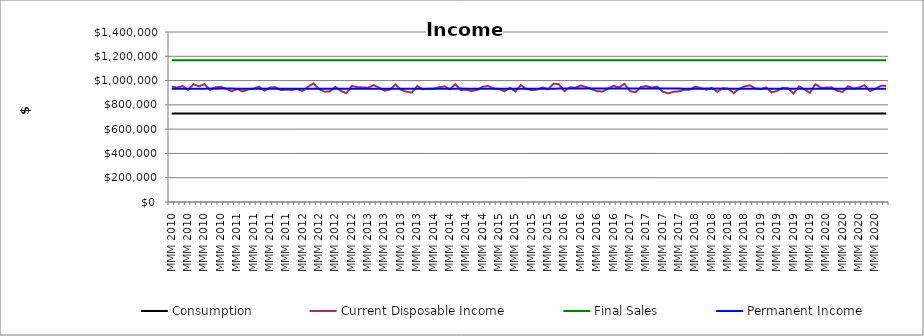
| Category | Consumption | Current Disposable Income | Final Sales | Permanent Income |
|---|---|---|---|---|
| MMM 2010 | 728000 | 950547.733 | 1167555.348 | 933333.333 |
| MMM 2010 | 728037.298 | 942081.337 | 1167587.925 | 933381.151 |
| MMM 2010 | 728056.148 | 955618.483 | 1167547.304 | 933405.318 |
| MMM 2010 | 728104.277 | 924047.333 | 1167688.777 | 933467.022 |
| MMM 2010 | 728083.867 | 969966.99 | 1167775.61 | 933440.856 |
| MMM 2010 | 728163.007 | 952516.851 | 1167748.387 | 933542.317 |
| MMM 2010 | 728204.119 | 970972.306 | 1167801.812 | 933595.024 |
| MMM 2010 | 728285.103 | 922945.713 | 1167863.32 | 933698.85 |
| MMM 2010 | 728261.805 | 944364.396 | 1167856.354 | 933668.98 |
| MMM 2010 | 728284.978 | 948574.709 | 1167923.499 | 933698.69 |
| MMM 2010 | 728317.209 | 932840.603 | 1167964.068 | 933740.012 |
| MMM 2010 | 728315.261 | 910995.255 | 1167988.229 | 933737.514 |
| MMM 2011 | 728265.986 | 930966.396 | 1167969.109 | 933674.341 |
| MMM 2011 | 728260.119 | 910307.312 | 1167927.119 | 933666.819 |
| MMM 2011 | 728209.506 | 927209.217 | 1167968.233 | 933601.931 |
| MMM 2011 | 728195.655 | 933638.354 | 1167876.107 | 933584.174 |
| MMM 2011 | 728195.773 | 950150.486 | 1167935.233 | 933584.324 |
| MMM 2011 | 728231.666 | 916823.252 | 1168064.914 | 933630.341 |
| MMM 2011 | 728195.251 | 942106.105 | 1168135.653 | 933583.655 |
| MMM 2011 | 728213.716 | 945400.962 | 1168028.992 | 933607.328 |
| MMM 2011 | 728239.269 | 920950.151 | 1168060.743 | 933640.088 |
| MMM 2011 | 728211.774 | 925268.782 | 1168107.6 | 933604.839 |
| MMM 2011 | 728193.713 | 922756.403 | 1167979.889 | 933581.683 |
| MMM 2011 | 728170.258 | 929890.56 | 1167988.446 | 933551.613 |
| MMM 2012 | 728162.326 | 914467.68 | 1167974.104 | 933541.443 |
| MMM 2012 | 728120.999 | 949306.701 | 1167985.787 | 933488.46 |
| MMM 2012 | 728155.272 | 976942.138 | 1168085.614 | 933532.4 |
| MMM 2012 | 728249.326 | 930227.293 | 1168207.326 | 933652.983 |
| MMM 2012 | 728241.904 | 908141.355 | 1168272.72 | 933643.467 |
| MMM 2012 | 728186.649 | 910837.618 | 1168288.374 | 933572.628 |
| MMM 2012 | 728137.39 | 949292.949 | 1168217.266 | 933509.475 |
| MMM 2012 | 728171.588 | 914965.109 | 1168207.924 | 933553.318 |
| MMM 2012 | 728131.313 | 895037.434 | 1168121.393 | 933501.684 |
| MMM 2012 | 728047.974 | 955815.453 | 1168095.476 | 933394.839 |
| MMM 2012 | 728096.552 | 946034.859 | 1168068.922 | 933457.118 |
| MMM 2012 | 728123.804 | 943565.118 | 1168091.332 | 933492.056 |
| MMM 2013 | 728145.629 | 941012.948 | 1168080.239 | 933520.037 |
| MMM 2013 | 728161.864 | 962536.249 | 1168079.969 | 933540.851 |
| MMM 2013 | 728224.687 | 942388.292 | 1168139.073 | 933621.393 |
| MMM 2013 | 728243.682 | 916511.342 | 1168079.257 | 933645.746 |
| MMM 2013 | 728206.557 | 924901.119 | 1168064.291 | 933598.15 |
| MMM 2013 | 728187.714 | 967873.083 | 1168023.345 | 933573.992 |
| MMM 2013 | 728262.028 | 925289.303 | 1168126.963 | 933669.267 |
| MMM 2013 | 728243.872 | 908082.449 | 1168146.308 | 933645.99 |
| MMM 2013 | 728188.484 | 900873.67 | 1168099.451 | 933574.98 |
| MMM 2013 | 728117.631 | 954590.442 | 1168121.55 | 933484.143 |
| MMM 2013 | 728163.362 | 928698.001 | 1168101.841 | 933542.771 |
| MMM 2013 | 728152.865 | 932699.549 | 1168017.22 | 933529.314 |
| MMM 2014 | 728151.067 | 933599.698 | 1168103.831 | 933527.009 |
| MMM 2014 | 728151.224 | 944696.719 | 1168197.069 | 933527.211 |
| MMM 2014 | 728175.425 | 953063.903 | 1168158.447 | 933558.237 |
| MMM 2014 | 728217.687 | 928919.445 | 1168141.669 | 933612.419 |
| MMM 2014 | 728207.519 | 970631.896 | 1168149.283 | 933599.383 |
| MMM 2014 | 728287.756 | 922718.086 | 1168148.025 | 933702.252 |
| MMM 2014 | 728263.957 | 924193.656 | 1168079.988 | 933671.74 |
| MMM 2014 | 728243.421 | 913464.733 | 1168050.206 | 933645.412 |
| MMM 2014 | 728199.696 | 923443.951 | 1167966.593 | 933589.354 |
| MMM 2014 | 728177.715 | 949062.441 | 1168036.239 | 933561.173 |
| MMM 2014 | 728211.301 | 955138.912 | 1168009.81 | 933604.232 |
| MMM 2014 | 728257.959 | 935493.658 | 1168142.297 | 933664.05 |
| MMM 2015 | 728261.923 | 930179.076 | 1168046.675 | 933669.133 |
| MMM 2015 | 728254.362 | 911245.709 | 1168101.18 | 933659.438 |
| MMM 2015 | 728205.799 | 940838.055 | 1168142.743 | 933597.178 |
| MMM 2015 | 728221.487 | 910093.219 | 1168139.191 | 933617.291 |
| MMM 2015 | 728170.518 | 963024.014 | 1168027.763 | 933551.947 |
| MMM 2015 | 728234.375 | 931484.727 | 1168204.906 | 933633.813 |
| MMM 2015 | 728229.718 | 921199.448 | 1168135.993 | 933627.844 |
| MMM 2015 | 728202.79 | 926154.453 | 1168174.009 | 933593.32 |
| MMM 2015 | 728186.672 | 942991.072 | 1168189.909 | 933572.657 |
| MMM 2015 | 728207.079 | 928921.938 | 1168289.345 | 933598.819 |
| MMM 2015 | 728196.946 | 974840.352 | 1168253.198 | 933585.828 |
| MMM 2015 | 728286.331 | 969109.925 | 1168260.315 | 933700.424 |
| MMM 2016 | 728363.051 | 912690.538 | 1168344.552 | 933798.784 |
| MMM 2016 | 728317.317 | 944135.746 | 1168265.613 | 933740.149 |
| MMM 2016 | 728339.84 | 940928.677 | 1168252.592 | 933769.026 |
| MMM 2016 | 728355.353 | 958388.785 | 1168236.626 | 933788.914 |
| MMM 2016 | 728408.653 | 946935.273 | 1168271.396 | 933857.247 |
| MMM 2016 | 728436.988 | 929155.926 | 1168345.628 | 933893.575 |
| MMM 2016 | 728426.724 | 912305.882 | 1168293.493 | 933880.415 |
| MMM 2016 | 728379.979 | 910098.423 | 1168185.85 | 933820.485 |
| MMM 2016 | 728328.581 | 933699.674 | 1168069.937 | 933754.591 |
| MMM 2016 | 728328.462 | 958027.511 | 1168062.941 | 933754.438 |
| MMM 2016 | 728381.054 | 943538.992 | 1168046.985 | 933821.864 |
| MMM 2016 | 728402.107 | 973132.35 | 1168122.628 | 933848.856 |
| MMM 2017 | 728487.222 | 913655.108 | 1168235.209 | 933957.976 |
| MMM 2017 | 728443.232 | 903923.716 | 1168108.926 | 933901.58 |
| MMM 2017 | 728378.28 | 946665.404 | 1167955.004 | 933818.308 |
| MMM 2017 | 728406.115 | 955064.129 | 1167933.835 | 933853.994 |
| MMM 2017 | 728452.071 | 941627.582 | 1167954.488 | 933912.911 |
| MMM 2017 | 728468.786 | 950713.518 | 1167938.464 | 933934.341 |
| MMM 2017 | 728505.141 | 909112.329 | 1167974.607 | 933980.95 |
| MMM 2017 | 728451.259 | 895409.707 | 1167980.556 | 933911.87 |
| MMM 2017 | 728367.837 | 907251.911 | 1167932.648 | 933804.92 |
| MMM 2017 | 728310.306 | 911820.516 | 1167919.264 | 933731.161 |
| MMM 2017 | 728262.833 | 924565.097 | 1167842.624 | 933670.298 |
| MMM 2017 | 728243.105 | 925477.257 | 1167826.654 | 933645.006 |
| MMM 2018 | 728225.408 | 950934.386 | 1167878.404 | 933622.318 |
| MMM 2018 | 728262.917 | 938551.823 | 1167943.341 | 933670.407 |
| MMM 2018 | 728273.494 | 924870.341 | 1167977.944 | 933683.966 |
| MMM 2018 | 728254.398 | 940529.351 | 1167862.488 | 933659.484 |
| MMM 2018 | 728269.282 | 908350.045 | 1167793.692 | 933678.567 |
| MMM 2018 | 728214.404 | 937571.687 | 1167716.552 | 933608.21 |
| MMM 2018 | 728222.991 | 933417.927 | 1167746.714 | 933619.22 |
| MMM 2018 | 728222.555 | 897377.025 | 1167689.225 | 933618.661 |
| MMM 2018 | 728144.032 | 931220.774 | 1167557.996 | 933517.989 |
| MMM 2018 | 728139.054 | 951995.786 | 1167575.457 | 933511.608 |
| MMM 2018 | 728179.104 | 960593.763 | 1167631.544 | 933562.953 |
| MMM 2018 | 728237.67 | 935362.995 | 1167741.925 | 933638.039 |
| MMM 2019 | 728241.408 | 930791.91 | 1167632.549 | 933642.83 |
| MMM 2019 | 728235.231 | 943239.881 | 1167661.411 | 933634.911 |
| MMM 2019 | 728256.041 | 902598.593 | 1167648.417 | 933661.592 |
| MMM 2019 | 728188.738 | 914882.933 | 1167520.022 | 933575.306 |
| MMM 2019 | 728148.238 | 940831.463 | 1167537.209 | 933523.382 |
| MMM 2019 | 728164.072 | 936812.272 | 1167552.516 | 933543.682 |
| MMM 2019 | 728171.154 | 893178.177 | 1167486.526 | 933552.762 |
| MMM 2019 | 728083.676 | 952674.681 | 1167487.328 | 933440.61 |
| MMM 2019 | 728125.35 | 927428.484 | 1167567.164 | 933494.038 |
| MMM 2019 | 728112.208 | 898843.09 | 1167474.628 | 933477.189 |
| MMM 2019 | 728037.167 | 970178.719 | 1167432.743 | 933380.984 |
| MMM 2019 | 728116.896 | 941146.522 | 1167528.338 | 933483.2 |
| MMM 2020 | 728133.5 | 942173.719 | 1167616.558 | 933504.487 |
| MMM 2020 | 728152.283 | 944224.344 | 1167551.012 | 933528.568 |
| MMM 2020 | 728175.457 | 915279.566 | 1167500.611 | 933558.278 |
| MMM 2020 | 728135.853 | 907231.572 | 1167492.599 | 933507.504 |
| MMM 2020 | 728078.922 | 953526.225 | 1167369.098 | 933434.515 |
| MMM 2020 | 728122.454 | 934150.567 | 1167503.277 | 933490.326 |
| MMM 2020 | 728123.885 | 942654.621 | 1167479.372 | 933492.16 |
| MMM 2020 | 728143.737 | 962032.303 | 1167397.048 | 933517.611 |
| MMM 2020 | 728205.518 | 912401.036 | 1167488.814 | 933596.818 |
| MMM 2020 | 728159.594 | 932132.456 | 1167345.117 | 933537.941 |
| MMM 2020 | 728156.549 | 958218.908 | 1167418.551 | 933534.037 |
| MMM 2020 | 728210.033 | 956326.247 | 1167454.79 | 933602.606 |